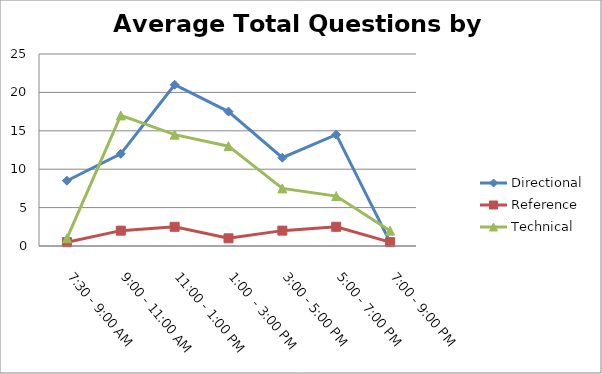
| Category | Directional | Reference | Technical |
|---|---|---|---|
| 7:30 - 9:00 AM | 8.5 | 0.5 | 1 |
| 9:00 - 11:00 AM | 12 | 2 | 17 |
| 11:00 - 1:00 PM | 21 | 2.5 | 14.5 |
| 1:00  - 3:00 PM | 17.5 | 1 | 13 |
| 3:00 - 5:00 PM | 11.5 | 2 | 7.5 |
| 5:00 - 7:00 PM | 14.5 | 2.5 | 6.5 |
| 7:00 - 9:00 PM | 0.5 | 0.5 | 2 |